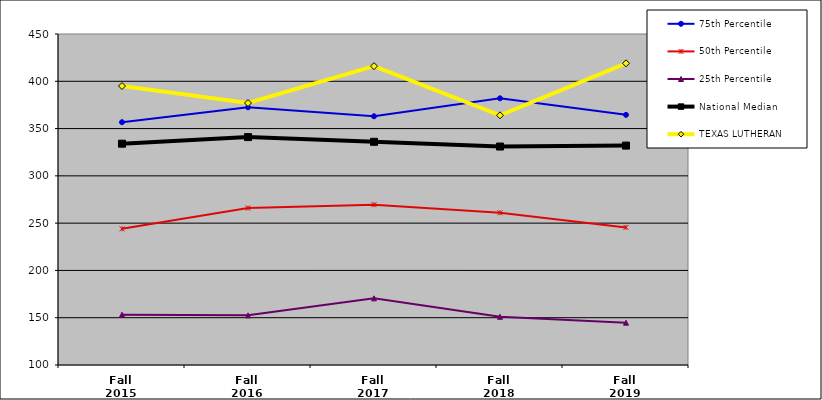
| Category | 75th Percentile | 50th Percentile | 25th Percentile | National Median | TEXAS LUTHERAN |
|---|---|---|---|---|---|
| Fall 2015 | 356.75 | 244 | 153.25 | 334 | 395 |
| Fall 2016 | 372.5 | 266 | 152.5 | 341 | 377 |
| Fall 2017 | 363 | 269.5 | 170.5 | 336 | 416 |
| Fall 2018 | 382 | 261 | 151 | 331 | 364 |
| Fall 2019 | 364.5 | 245.5 | 144.75 | 332 | 419 |